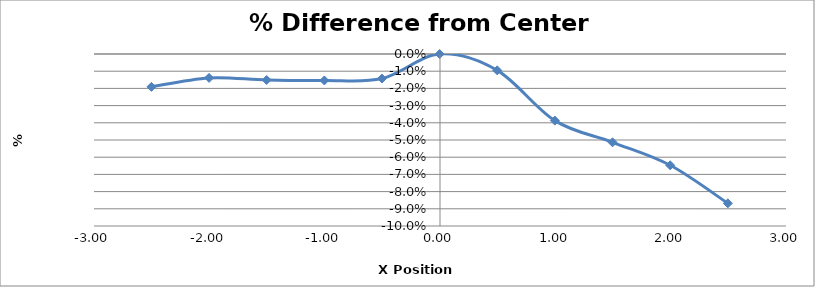
| Category | Series 0 |
|---|---|
| -2.502 | -0.019 |
| -2.002 | -0.014 |
| -1.5030000000000001 | -0.015 |
| -1.0030000000000001 | -0.015 |
| -0.5030000000000001 | -0.014 |
| -0.0030000000000001137 | 0 |
| 0.49599999999999955 | -0.01 |
| 0.9959999999999996 | -0.039 |
| 1.4959999999999996 | -0.051 |
| 1.9959999999999996 | -0.065 |
| 2.4959999999999996 | -0.087 |